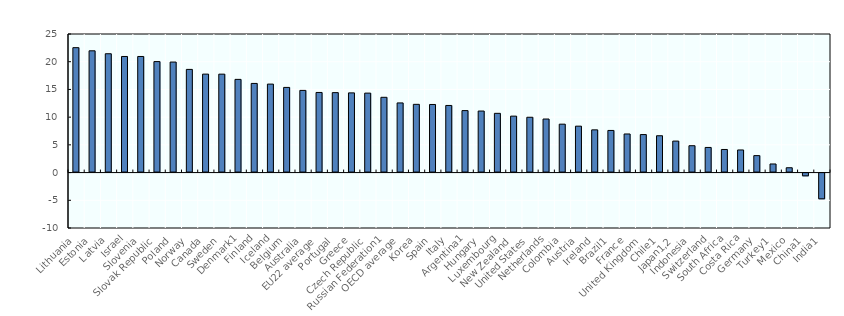
| Category | Difference between women and men |
|---|---|
| Lithuania | 22.534 |
| Estonia | 21.968 |
| Latvia | 21.437 |
| Israel | 20.946 |
| Slovenia | 20.944 |
| Slovak Republic | 20.023 |
| Poland | 19.937 |
| Norway | 18.614 |
| Canada | 17.761 |
| Sweden | 17.757 |
| Denmark1 | 16.813 |
| Finland | 16.082 |
| Iceland | 15.961 |
| Belgium | 15.364 |
| Australia | 14.825 |
| EU22 average | 14.452 |
| Portugal | 14.422 |
| Greece | 14.377 |
| Czech Republic | 14.334 |
| Russian Federation1 | 13.578 |
| OECD average | 12.565 |
| Korea | 12.311 |
| Spain | 12.284 |
| Italy | 12.107 |
| Argentina1 | 11.181 |
| Hungary | 11.101 |
| Luxembourg | 10.688 |
| New Zealand | 10.183 |
| United States | 9.978 |
| Netherlands | 9.66 |
| Colombia | 8.733 |
| Austria | 8.373 |
| Ireland | 7.707 |
| Brazil1 | 7.6 |
| France | 6.962 |
| United Kingdom | 6.857 |
| Chile1 | 6.643 |
| Japan1,2 | 5.68 |
| Indonesia | 4.845 |
| Switzerland | 4.532 |
| South Africa | 4.167 |
| Costa Rica | 4.08 |
| Germany | 3.058 |
| Turkey1 | 1.55 |
| Mexico | 0.872 |
| China1 | -0.678 |
| India1 | -4.827 |